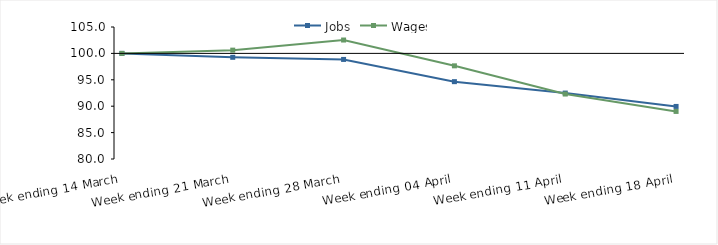
| Category | Jobs | Wages |
|---|---|---|
| 0 | 100 | 100 |
| 1900-01-01 | 99.261 | 100.617 |
| 1900-01-02 | 98.858 | 102.533 |
| 1900-01-03 | 94.649 | 97.645 |
| 1900-01-04 | 92.486 | 92.303 |
| 1900-01-05 | 89.955 | 89.011 |